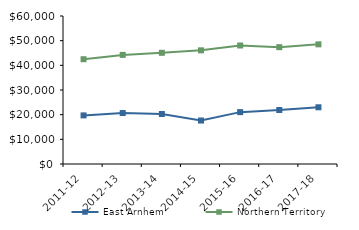
| Category | East Arnhem | Northern Territory |
|---|---|---|
| 2011-12 | 19704.43 | 42481 |
| 2012-13 | 20660.1 | 44232.02 |
| 2013-14 | 20277.78 | 45075.51 |
| 2014-15 | 17621.39 | 46083.65 |
| 2015-16 | 21025.94 | 48046.27 |
| 2016-17 | 21893.92 | 47367.05 |
| 2017-18 | 22995 | 48519 |